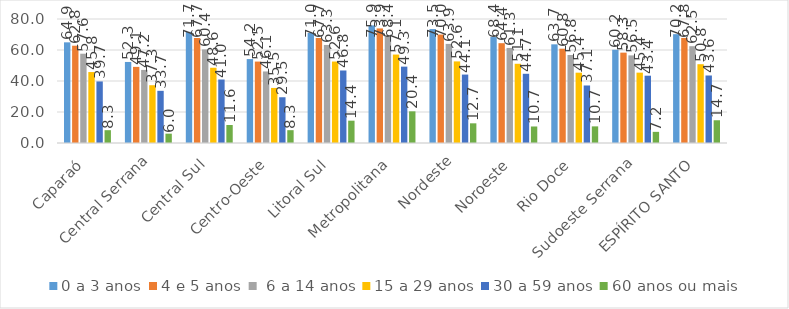
| Category | 0 a 3 anos | 4 e 5 anos |  6 a 14 anos | 15 a 29 anos | 30 a 59 anos | 60 anos ou mais |
|---|---|---|---|---|---|---|
| Caparaó | 64.945 | 62.758 | 57.598 | 45.774 | 39.71 | 8.268 |
| Central Serrana | 52.285 | 49.112 | 47.153 | 37.28 | 33.661 | 6.022 |
| Central Sul | 71.719 | 67.741 | 60.364 | 48.55 | 40.961 | 11.606 |
| Centro-Oeste | 54.152 | 52.538 | 46.148 | 35.521 | 29.519 | 8.273 |
| Litoral Sul | 70.957 | 67.742 | 63.263 | 52.557 | 46.78 | 14.405 |
| Metropolitana | 75.896 | 73.92 | 68.428 | 57.061 | 49.271 | 20.431 |
| Nordeste | 73.515 | 69.964 | 63.941 | 52.649 | 44.147 | 12.696 |
| Noroeste | 68.353 | 64.395 | 61.324 | 51.108 | 44.66 | 10.658 |
| Rio Doce | 63.659 | 60.842 | 56.757 | 45.367 | 37.11 | 10.726 |
| Sudoeste Serrana | 60.155 | 58.3 | 56.52 | 45.392 | 43.424 | 7.189 |
| ESPÍRITO SANTO | 70.217 | 67.785 | 62.456 | 50.836 | 43.551 | 14.674 |